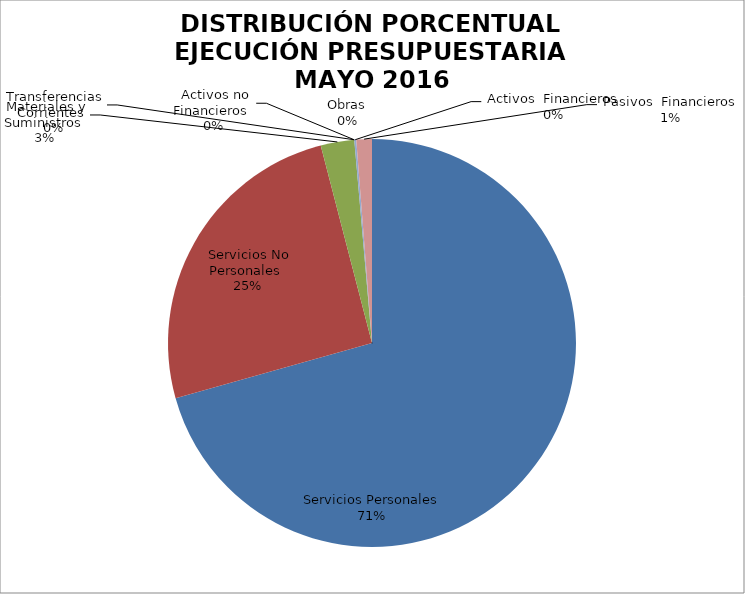
| Category | Series 0 | Series 1 |
|---|---|---|
| Servicios Personales | 11146256.34 | 0.706 |
| Servicios No Personales | 3994399.39 | 0.253 |
| Materiales y Suministros | 419187.73 | 0.027 |
| Transferencias Corrientes | 0 | 0 |
| Activos no Financieros | 0 | 0 |
| Obras | 0 | 0 |
| Activos  Financieros | 24675.23 | 0.002 |
| Pasivos  Financieros | 194128.16 | 0.012 |